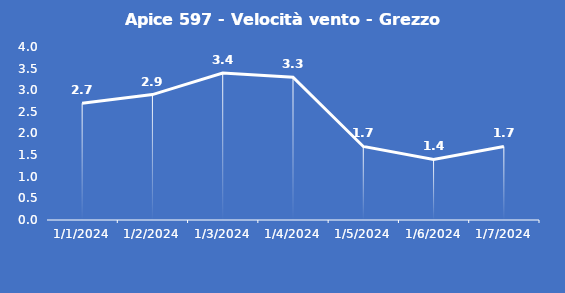
| Category | Apice 597 - Velocità vento - Grezzo (m/s) |
|---|---|
| 1/1/24 | 2.7 |
| 1/2/24 | 2.9 |
| 1/3/24 | 3.4 |
| 1/4/24 | 3.3 |
| 1/5/24 | 1.7 |
| 1/6/24 | 1.4 |
| 1/7/24 | 1.7 |